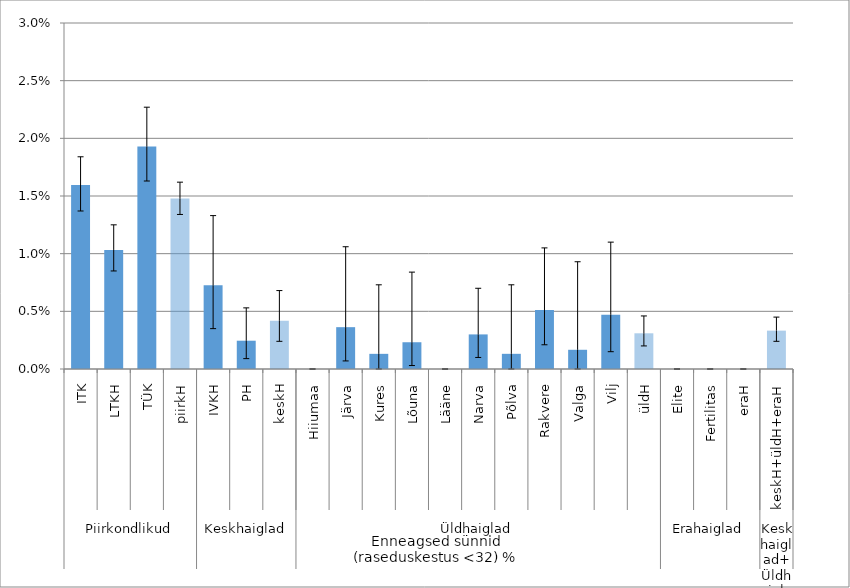
| Category | 2013–2015
Enneagsed sünnid
(raseduskestus <32) % |
|---|---|
| 0 | 0.016 |
| 1 | 0.01 |
| 2 | 0.019 |
| 3 | 0.015 |
| 4 | 0.007 |
| 5 | 0.002 |
| 6 | 0.004 |
| 7 | 0 |
| 8 | 0.004 |
| 9 | 0.001 |
| 10 | 0.002 |
| 11 | 0 |
| 12 | 0.003 |
| 13 | 0.001 |
| 14 | 0.005 |
| 15 | 0.002 |
| 16 | 0.005 |
| 17 | 0.003 |
| 18 | 0 |
| 19 | 0 |
| 20 | 0 |
| 21 | 0.003 |